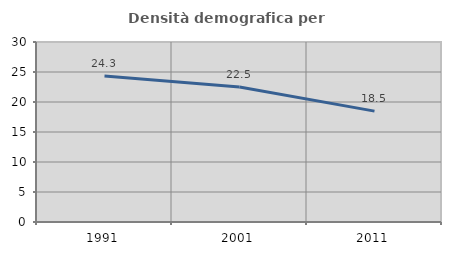
| Category | Densità demografica |
|---|---|
| 1991.0 | 24.333 |
| 2001.0 | 22.494 |
| 2011.0 | 18.48 |